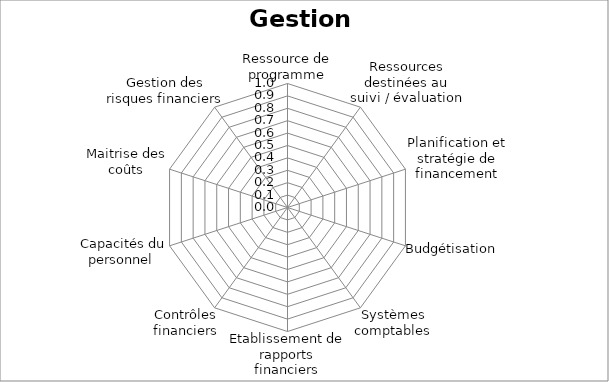
| Category | Series 0 |
|---|---|
| Ressource de programme | 0 |
| Ressources destinées au suivi / évaluation | 0 |
| Planification et stratégie de financement | 0 |
| Budgétisation | 0 |
| Systèmes comptables | 0 |
| Etablissement de rapports financiers | 0 |
| Contrôles financiers | 0 |
| Capacités du personnel  | 0 |
| Maitrise des coûts | 0 |
| Gestion des risques financiers | 0 |